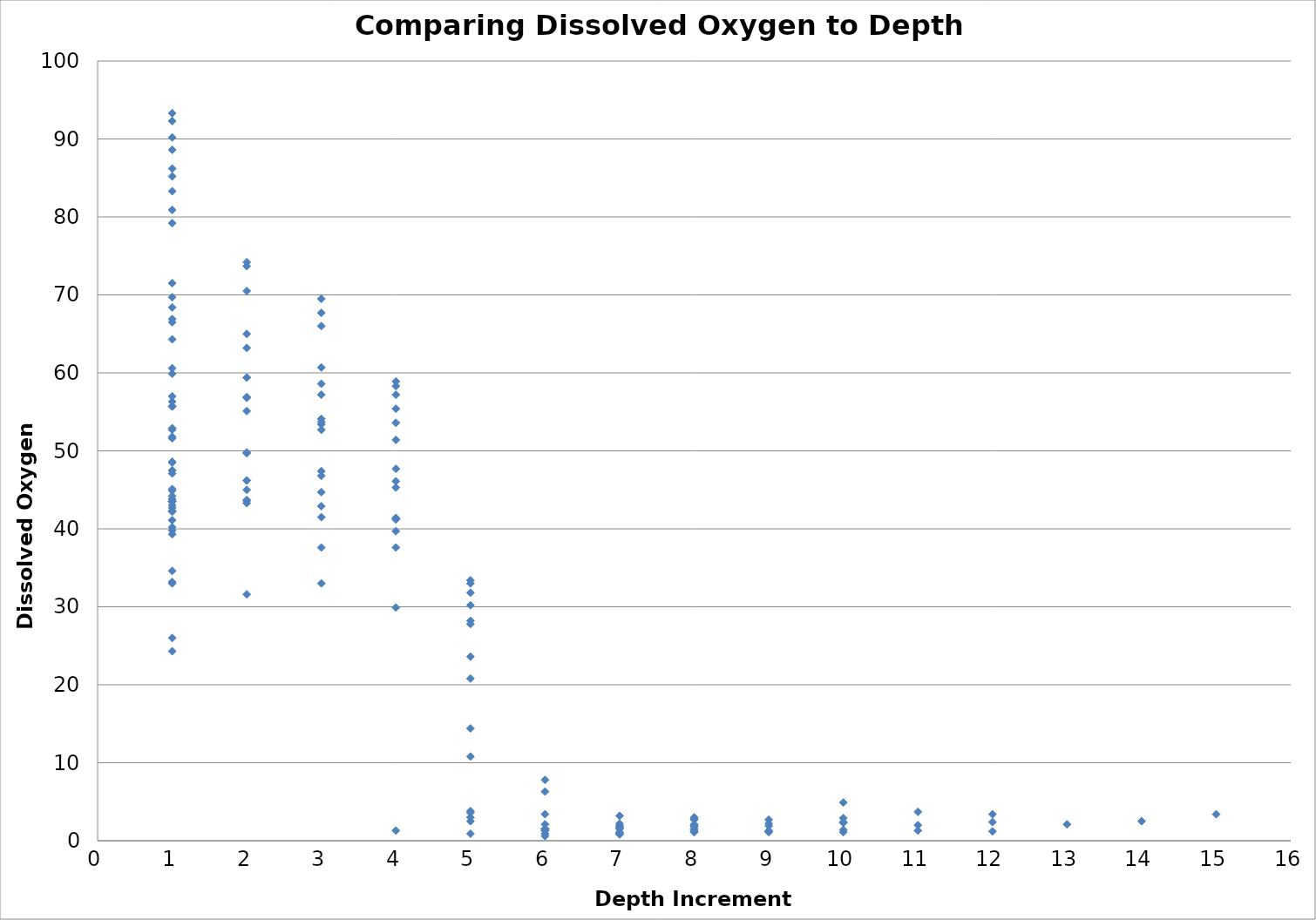
| Category | Dissolved Oxygen % |
|---|---|
| 1.0 | 52.9 |
| 1.0 | 51.6 |
| 1.0 | 55.7 |
| 1.0 | 56.3 |
| 1.0 | 47.5 |
| 1.0 | 71.5 |
| 2.0 | 70.5 |
| 3.0 | 67.7 |
| 4.0 | 57.2 |
| 5.0 | 10.8 |
| 1.0 | 64.3 |
| 2.0 | 63.2 |
| 3.0 | 60.7 |
| 4.0 | 58.9 |
| 5.0 | 28.2 |
| 6.0 | 7.8 |
| 7.0 | 3.2 |
| 8.0 | 2.8 |
| 1.0 | 60.6 |
| 2.0 | 59.4 |
| 3.0 | 58.6 |
| 4.0 | 58.3 |
| 1.0 | 47.1 |
| 2.0 | 46.2 |
| 3.0 | 46.8 |
| 4.0 | 41.4 |
| 5.0 | 14.4 |
| 6.0 | 1.5 |
| 7.0 | 1.7 |
| 8.0 | 2 |
| 1.0 | 44.9 |
| 2.0 | 43.6 |
| 3.0 | 37.6 |
| 4.0 | 1.3 |
| 5.0 | 0.9 |
| 6.0 | 0.6 |
| 7.0 | 0.8 |
| 8.0 | 1.1 |
| 9.0 | 1.3 |
| 10.0 | 2.3 |
| 1.0 | 39.8 |
| 1.0 | 48.6 |
| 2.0 | 49.7 |
| 1.0 | 48.5 |
| 1.0 | 42.3 |
| 1.0 | 52.7 |
| 2.0 | 55.1 |
| 3.0 | 53.7 |
| 4.0 | 47.7 |
| 5.0 | 23.6 |
| 1.0 | 47.5 |
| 2.0 | 46.2 |
| 3.0 | 44.7 |
| 4.0 | 39.7 |
| 5.0 | 31.8 |
| 6.0 | 1.5 |
| 7.0 | 1.9 |
| 8.0 | 2.7 |
| 1.0 | 59.9 |
| 2.0 | 59.4 |
| 3.0 | 57.2 |
| 4.0 | 53.6 |
| 5.0 | 33.4 |
| 6.0 | 6.3 |
| 7.0 | 1.6 |
| 8.0 | 1.8 |
| 9.0 | 2.2 |
| 10.0 | 2.9 |
| 11.0 | 3.7 |
| 12.0 | 2.4 |
| 1.0 | 33.2 |
| 2.0 | 31.6 |
| 3.0 | 33 |
| 4.0 | 29.9 |
| 5.0 | 20.8 |
| 6.0 | 3.4 |
| 1.0 | 57 |
| 2.0 | 56.9 |
| 3.0 | 53.4 |
| 4.0 | 51.4 |
| 5.0 | 33 |
| 6.0 | 2.1 |
| 7.0 | 2.2 |
| 8.0 | 3 |
| 1.0 | 51.8 |
| 2.0 | 49.8 |
| 3.0 | 47.4 |
| 4.0 | 45.3 |
| 5.0 | 27.8 |
| 6.0 | 1.5 |
| 7.0 | 1.9 |
| 8.0 | 2.1 |
| 9.0 | 2.7 |
| 10.0 | 4.9 |
| 1.0 | 42.2 |
| 1.0 | 44.2 |
| 1.0 | 39.3 |
| 1.0 | 43.5 |
| 2.0 | 45 |
| 1.0 | 43.8 |
| 1.0 | 43.5 |
| 2.0 | 43.7 |
| 3.0 | 42.9 |
| 4.0 | 41.3 |
| 5.0 | 30.2 |
| 6.0 | 1.3 |
| 7.0 | 1.1 |
| 8.0 | 1.5 |
| 9.0 | 1.9 |
| 10.0 | 2.4 |
| 1.0 | 66.5 |
| 1.0 | 69.7 |
| 1.0 | 80.9 |
| 2.0 | 74.2 |
| 3.0 | 69.5 |
| 4.0 | 46.1 |
| 5.0 | 3.8 |
| 1.0 | 66.9 |
| 1.0 | 93.3 |
| 1.0 | 88.6 |
| 1.0 | 85.2 |
| 2.0 | 73.7 |
| 3.0 | 52.7 |
| 1.0 | 83.3 |
| 1.0 | 79.2 |
| 1.0 | 86.2 |
| 1.0 | 92.3 |
| 1.0 | 90.2 |
| 1.0 | 55.7 |
| 2.0 | 56.8 |
| 3.0 | 54.1 |
| 4.0 | 41.2 |
| 5.0 | 3 |
| 6.0 | 1.3 |
| 7.0 | 1.5 |
| 8.0 | 1.8 |
| 1.0 | 43.5 |
| 2.0 | 43.3 |
| 3.0 | 41.5 |
| 4.0 | 37.6 |
| 5.0 | 3.6 |
| 6.0 | 0.9 |
| 7.0 | 1 |
| 8.0 | 1.1 |
| 9.0 | 1.2 |
| 10.0 | 1.4 |
| 11.0 | 2 |
| 12.0 | 3.4 |
| 1.0 | 40.2 |
| 1.0 | 68.4 |
| 2.0 | 65 |
| 3.0 | 66 |
| 4.0 | 55.4 |
| 5.0 | 2.5 |
| 6.0 | 1.5 |
| 7.0 | 0.9 |
| 8.0 | 1.3 |
| 9.0 | 1.1 |
| 10.0 | 1.1 |
| 11.0 | 1.3 |
| 12.0 | 1.2 |
| 13.0 | 2.1 |
| 14.0 | 2.5 |
| 15.0 | 3.4 |
| 1.0 | 41.1 |
| 1.0 | 26 |
| 1.0 | 45.1 |
| 1.0 | 33 |
| 1.0 | 24.3 |
| 1.0 | 34.6 |
| 1.0 | 42.7 |
| 1.0 | 43 |